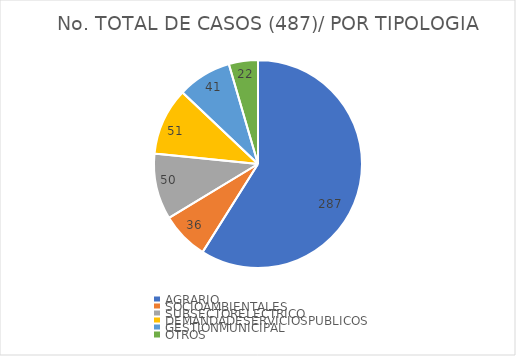
| Category | No. DE CASOS |
|---|---|
| AGRARIO | 287 |
| SOCIOAMBIENTALES | 36 |
| SUBSECTORELECTRICO | 50 |
| DEMANDADESERVICIOSPUBLICOS | 51 |
| GESTIONMUNICIPAL | 41 |
| OTROS | 22 |